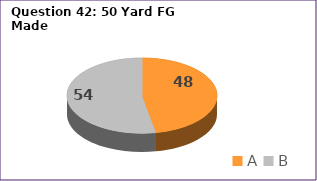
| Category | Series 0 |
|---|---|
| A | 48 |
| B | 54 |